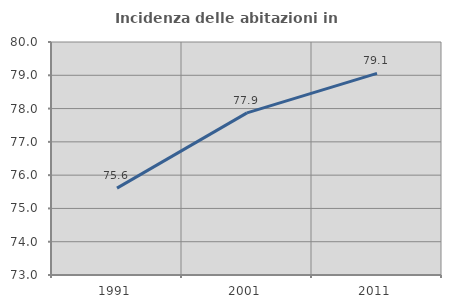
| Category | Incidenza delle abitazioni in proprietà  |
|---|---|
| 1991.0 | 75.61 |
| 2001.0 | 77.871 |
| 2011.0 | 79.058 |